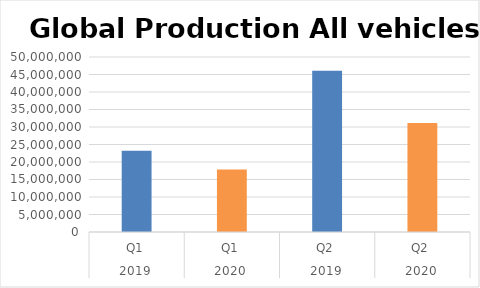
| Category | Series 0 |
|---|---|
| 0 | 23215782 |
| 1 | 17862363 |
| 2 | 46066496 |
| 3 | 31131075 |